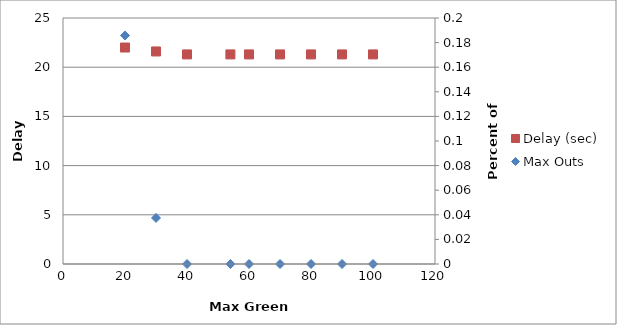
| Category | Delay (sec) |
|---|---|
| 100.0 | 21.3 |
| 90.0 | 21.3 |
| 80.0 | 21.3 |
| 70.0 | 21.3 |
| 60.0 | 21.3 |
| 54.0 | 21.3 |
| 40.0 | 21.3 |
| 30.0 | 21.6 |
| 20.0 | 22 |